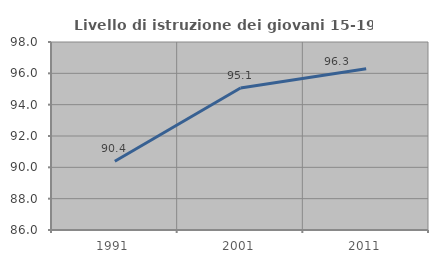
| Category | Livello di istruzione dei giovani 15-19 anni |
|---|---|
| 1991.0 | 90.385 |
| 2001.0 | 95.062 |
| 2011.0 | 96.296 |